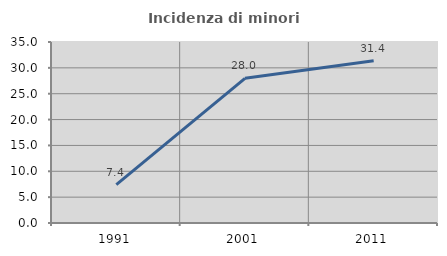
| Category | Incidenza di minori stranieri |
|---|---|
| 1991.0 | 7.407 |
| 2001.0 | 27.969 |
| 2011.0 | 31.382 |